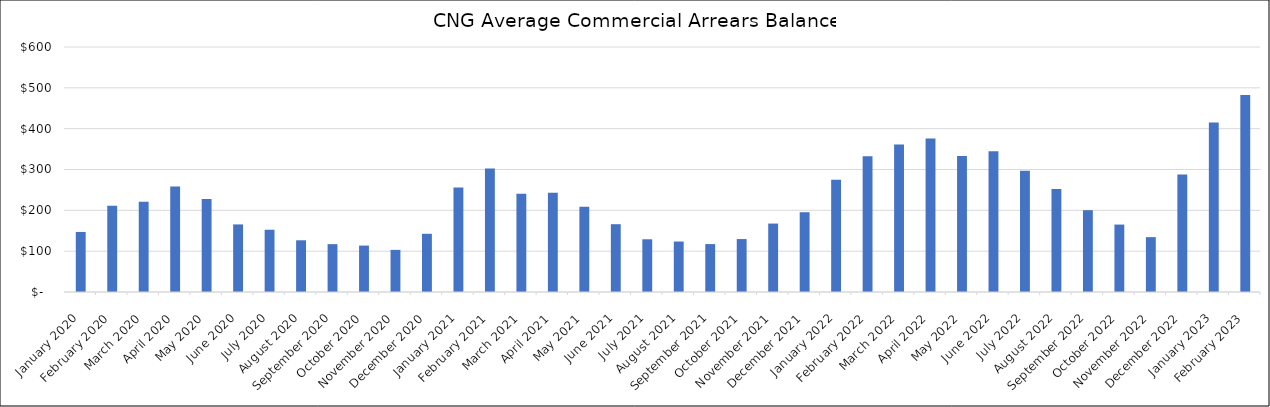
| Category | Average Arrears Balance |
|---|---|
| 2020-01-01 | 147.062 |
| 2020-02-01 | 211.53 |
| 2020-03-01 | 220.739 |
| 2020-04-01 | 258.066 |
| 2020-05-01 | 227.862 |
| 2020-06-01 | 165.513 |
| 2020-07-01 | 152.451 |
| 2020-08-01 | 126.639 |
| 2020-09-01 | 117.208 |
| 2020-10-01 | 113.696 |
| 2020-11-01 | 103.184 |
| 2020-12-01 | 142.558 |
| 2021-01-01 | 255.856 |
| 2021-02-01 | 302.377 |
| 2021-03-01 | 240.848 |
| 2021-04-01 | 243.268 |
| 2021-05-01 | 208.967 |
| 2021-06-01 | 166.058 |
| 2021-07-01 | 129.124 |
| 2021-08-01 | 123.628 |
| 2021-09-01 | 117.366 |
| 2021-10-01 | 129.633 |
| 2021-11-01 | 167.572 |
| 2021-12-01 | 195.387 |
| 2022-01-01 | 275.043 |
| 2022-02-01 | 332.228 |
| 2022-03-01 | 361.401 |
| 2022-04-01 | 376.135 |
| 2022-05-01 | 333.36 |
| 2022-06-01 | 344.764 |
| 2022-07-01 | 297.24 |
| 2022-08-01 | 252.175 |
| 2022-09-01 | 200.341 |
| 2022-10-01 | 165.139 |
| 2022-11-01 | 134.374 |
| 2022-12-01 | 287.983 |
| 2023-01-01 | 415.198 |
| 2023-02-01 | 482.442 |